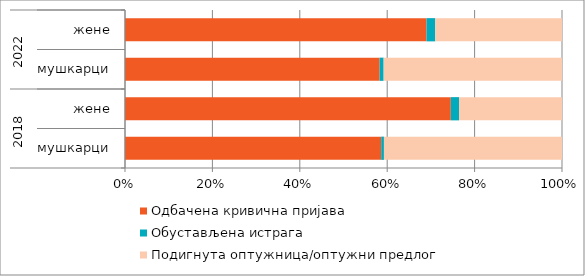
| Category | Одбачена кривична пријава | Обустављена истрага | Подигнута оптужница/оптужни предлог |
|---|---|---|---|
| 0 | 58.622 | 0.632 | 40.747 |
| 1 | 74.553 | 1.893 | 23.554 |
| 2 | 58.269 | 0.917 | 40.814 |
| 3 | 69 | 2 | 29 |